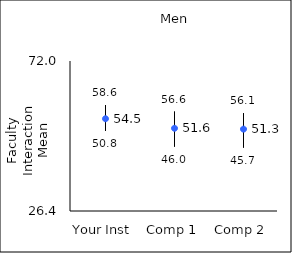
| Category | 25th percentile | 75th percentile | Mean |
|---|---|---|---|
| Your Inst | 50.8 | 58.6 | 54.45 |
| Comp 1 | 46 | 56.6 | 51.55 |
| Comp 2 | 45.7 | 56.1 | 51.29 |